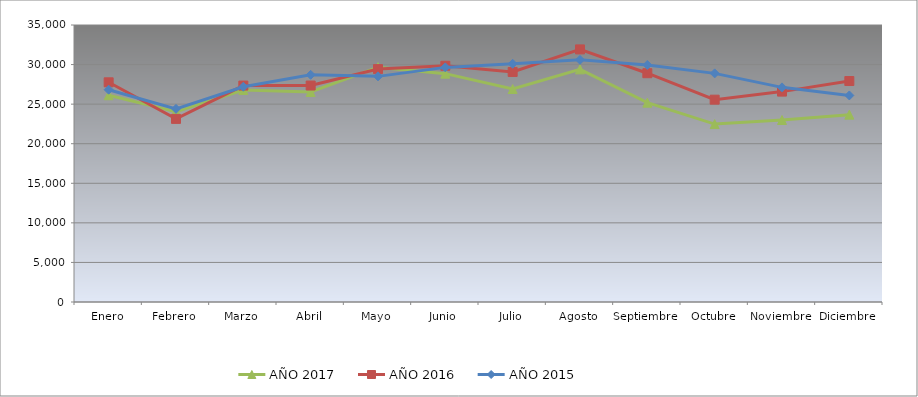
| Category | AÑO 2017 | AÑO 2016 | AÑO 2015 |
|---|---|---|---|
| Enero | 26125.328 | 27759.702 | 26826.392 |
| Febrero | 24057.484 | 23134.657 | 24405.678 |
| Marzo | 26790.759 | 27344.215 | 27198.98 |
| Abril | 26536.655 | 27351.129 | 28705.563 |
| Mayo | 29674.04 | 29430.451 | 28509.564 |
| Junio | 28854.61 | 29850.967 | 29644.83 |
| Julio | 26912.668 | 29069.021 | 30103.009 |
| Agosto | 29393.22 | 31916.461 | 30596.188 |
| Septiembre | 25186.906 | 28908.107 | 29954.737 |
| Octubre | 22477.276 | 25565.351 | 28888.198 |
| Noviembre | 22995.619 | 26583.955 | 27120.072 |
| Diciembre | 23674.869 | 27920.617 | 26098.396 |